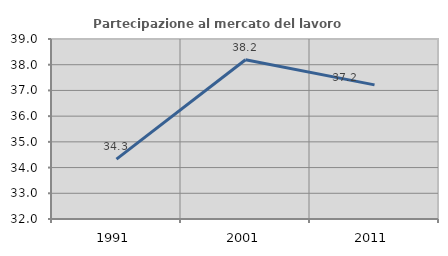
| Category | Partecipazione al mercato del lavoro  femminile |
|---|---|
| 1991.0 | 34.33 |
| 2001.0 | 38.193 |
| 2011.0 | 37.217 |